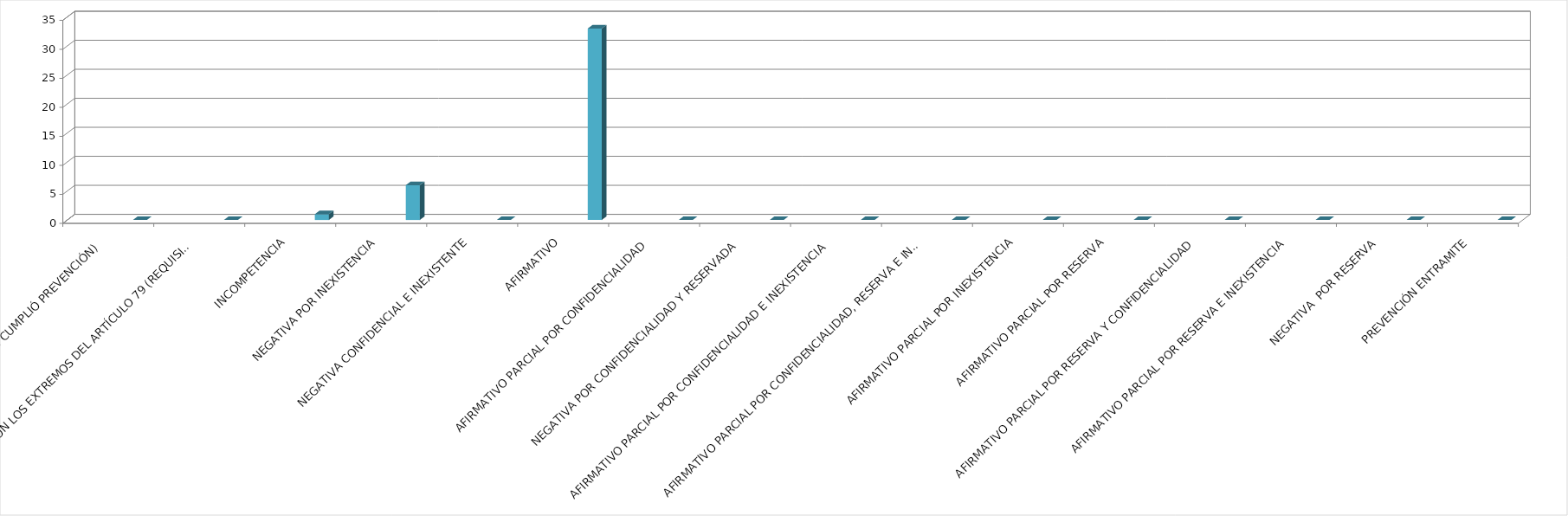
| Category | Series 0 | Series 1 | Series 2 | Series 3 | Series 4 |
|---|---|---|---|---|---|
| SE TIENE POR NO PRESENTADA ( NO CUMPLIÓ PREVENCIÓN) |  |  |  |  | 0 |
| NO CUMPLIO CON LOS EXTREMOS DEL ARTÍCULO 79 (REQUISITOS) |  |  |  |  | 0 |
| INCOMPETENCIA |  |  |  |  | 1 |
| NEGATIVA POR INEXISTENCIA |  |  |  |  | 6 |
| NEGATIVA CONFIDENCIAL E INEXISTENTE |  |  |  |  | 0 |
| AFIRMATIVO |  |  |  |  | 33 |
| AFIRMATIVO PARCIAL POR CONFIDENCIALIDAD |  |  |  |  | 0 |
| NEGATIVA POR CONFIDENCIALIDAD Y RESERVADA |  |  |  |  | 0 |
| AFIRMATIVO PARCIAL POR CONFIDENCIALIDAD E INEXISTENCIA |  |  |  |  | 0 |
| AFIRMATIVO PARCIAL POR CONFIDENCIALIDAD, RESERVA E INEXISTENCIA |  |  |  |  | 0 |
| AFIRMATIVO PARCIAL POR INEXISTENCIA |  |  |  |  | 0 |
| AFIRMATIVO PARCIAL POR RESERVA |  |  |  |  | 0 |
| AFIRMATIVO PARCIAL POR RESERVA Y CONFIDENCIALIDAD |  |  |  |  | 0 |
| AFIRMATIVO PARCIAL POR RESERVA E INEXISTENCIA |  |  |  |  | 0 |
| NEGATIVA  POR RESERVA |  |  |  |  | 0 |
| PREVENCIÓN ENTRAMITE |  |  |  |  | 0 |